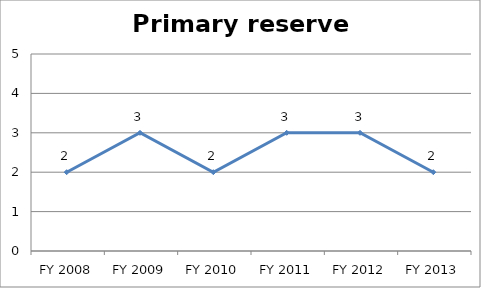
| Category | Primary reserve score |
|---|---|
| FY 2013 | 2 |
| FY 2012 | 3 |
| FY 2011 | 3 |
| FY 2010 | 2 |
| FY 2009 | 3 |
| FY 2008 | 2 |